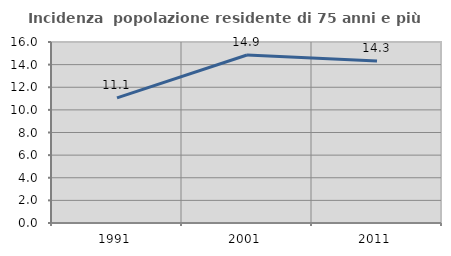
| Category | Incidenza  popolazione residente di 75 anni e più |
|---|---|
| 1991.0 | 11.065 |
| 2001.0 | 14.852 |
| 2011.0 | 14.325 |